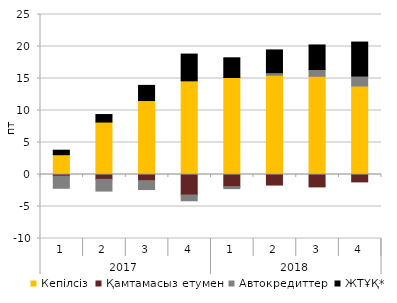
| Category | Кепілсіз | Қамтамасыз етумен | Автокредиттер | ЖТҰҚ* |
|---|---|---|---|---|
| 0 | 3.093 | -0.266 | -1.884 | 0.705 |
| 1 | 8.196 | -0.756 | -1.835 | 1.174 |
| 2 | 11.554 | -0.96 | -1.393 | 2.369 |
| 3 | 14.637 | -3.207 | -0.898 | 4.179 |
| 4 | 15.152 | -1.898 | -0.31 | 3.083 |
| 5 | 15.51 | -1.649 | 0.406 | 3.549 |
| 6 | 15.35 | -1.938 | 1.056 | 3.837 |
| 7 | 13.834 | -1.154 | 1.55 | 5.309 |